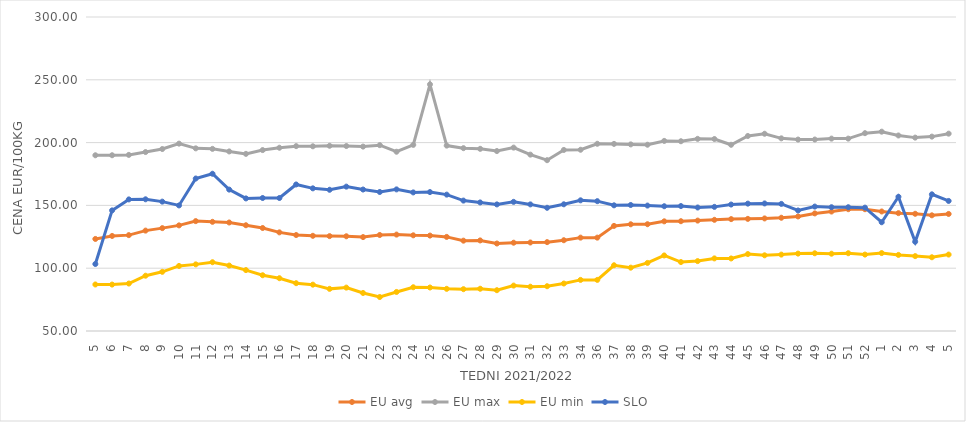
| Category | EU avg | EU max | EU min | SLO |
|---|---|---|---|---|
| 5.0 | 123.293 | 189.91 | 87.04 | 103.34 |
| 6.0 | 125.679 | 189.94 | 86.97 | 146.03 |
| 7.0 | 126.33 | 190.21 | 87.79 | 154.77 |
| 8.0 | 129.933 | 192.48 | 94.02 | 154.86 |
| 9.0 | 131.908 | 194.884 | 97.12 | 153 |
| 10.0 | 134.098 | 199.17 | 101.79 | 149.98 |
| 11.0 | 137.49 | 195.419 | 103.05 | 171.4 |
| 12.0 | 136.929 | 195.013 | 104.76 | 175.2 |
| 13.0 | 136.39 | 192.952 | 102.11 | 162.57 |
| 14.0 | 134.198 | 191.034 | 98.5 | 155.55 |
| 15.0 | 132.003 | 194.047 | 94.39 | 155.88 |
| 16.0 | 128.53 | 195.913 | 92.04 | 155.88 |
| 17.0 | 126.415 | 197.188 | 88.07 | 166.66 |
| 18.0 | 125.787 | 197.055 | 86.89 | 163.58 |
| 19.0 | 125.54 | 197.478 | 83.546 | 162.44 |
| 20.0 | 125.412 | 197.263 | 84.55 | 164.94 |
| 21.0 | 124.768 | 196.821 | 80.264 | 162.64 |
| 22.0 | 126.43 | 197.963 | 77.048 | 160.68 |
| 23.0 | 126.76 | 192.72 | 81.087 | 162.75 |
| 24.0 | 126.19 | 198.186 | 84.83 | 160.34 |
| 25.0 | 125.97 | 246.36 | 84.63 | 160.6 |
| 26.0 | 124.92 | 197.607 | 83.57 | 158.57 |
| 27.0 | 121.922 | 195.566 | 83.3 | 153.83 |
| 28.0 | 122.106 | 195.043 | 83.64 | 152.35 |
| 29.0 | 119.659 | 193.272 | 82.49 | 150.79 |
| 30.0 | 120.3 | 196.01 | 86.16 | 152.82 |
| 31.0 | 120.473 | 190.42 | 85.26 | 150.8 |
| 32.0 | 120.756 | 186 | 85.65 | 148.1 |
| 33.0 | 122.274 | 194.145 | 87.8 | 150.88 |
| 34.0 | 124.332 | 194.304 | 90.69 | 154.04 |
| 36.0 | 124.332 | 199.06 | 90.69 | 153.37 |
| 37.0 | 133.685 | 198.97 | 102.334 | 150.06 |
| 38.0 | 134.959 | 198.57 | 100.43 | 150.32 |
| 39.0 | 135.021 | 198.3 | 104.21 | 149.86 |
| 40.0 | 137.315 | 201.34 | 110.15 | 149.34 |
| 41.0 | 137.411 | 201.081 | 104.9 | 149.48 |
| 42.0 | 137.908 | 202.98 | 105.65 | 148.32 |
| 43.0 | 138.52 | 202.856 | 107.8 | 148.83 |
| 44.0 | 139.076 | 198.26 | 107.75 | 150.69 |
| 45.0 | 139.275 | 205.257 | 111.25 | 151.41 |
| 46.0 | 139.626 | 207.046 | 110.26 | 151.56 |
| 47.0 | 140.17 | 203.387 | 110.83 | 151.2 |
| 48.0 | 141.2 | 202.42 | 111.62 | 145.97 |
| 49.0 | 143.614 | 202.45 | 111.89 | 149.07 |
| 50.0 | 145.101 | 203.17 | 111.54 | 148.55 |
| 51.0 | 146.984 | 203.17 | 111.93 | 148.54 |
| 52.0 | 146.958 | 207.5 | 110.85 | 148.22 |
| 1.0 | 145.157 | 208.7 | 112.04 | 136.59 |
| 2.0 | 143.842 | 205.67 | 110.59 | 156.88 |
| 3.0 | 143.324 | 203.97 | 109.62 | 121.07 |
| 4.0 | 142.105 | 204.76 | 108.71 | 158.82 |
| 5.0 | 143.193 | 207.12 | 110.86 | 153.55 |